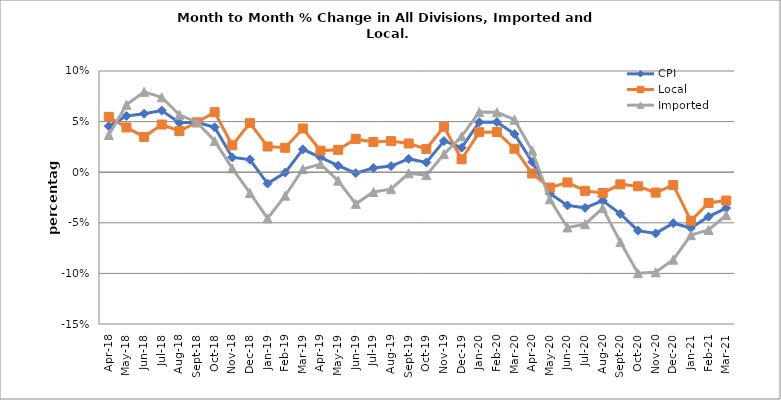
| Category | CPI | Local | Imported |
|---|---|---|---|
| 2018-04-01 | 0.045 | 0.055 | 0.037 |
| 2018-05-01 | 0.056 | 0.044 | 0.067 |
| 2018-06-01 | 0.058 | 0.035 | 0.079 |
| 2018-07-01 | 0.061 | 0.047 | 0.074 |
| 2018-08-01 | 0.049 | 0.041 | 0.057 |
| 2018-09-01 | 0.049 | 0.049 | 0.049 |
| 2018-10-01 | 0.044 | 0.059 | 0.031 |
| 2018-11-01 | 0.015 | 0.027 | 0.004 |
| 2018-12-01 | 0.012 | 0.049 | -0.021 |
| 2019-01-01 | -0.011 | 0.025 | -0.046 |
| 2019-02-01 | 0 | 0.024 | -0.023 |
| 2019-03-01 | 0.023 | 0.043 | 0.003 |
| 2019-04-01 | 0.015 | 0.021 | 0.008 |
| 2019-05-01 | 0.006 | 0.022 | -0.008 |
| 2019-06-01 | -0.001 | 0.033 | -0.031 |
| 2019-07-01 | 0.004 | 0.03 | -0.02 |
| 2019-08-01 | 0.006 | 0.031 | -0.017 |
| 2019-09-01 | 0.013 | 0.028 | -0.001 |
| 2019-10-01 | 0.01 | 0.023 | -0.003 |
| 2019-11-01 | 0.031 | 0.045 | 0.018 |
| 2019-12-01 | 0.024 | 0.013 | 0.035 |
| 2020-01-01 | 0.049 | 0.039 | 0.059 |
| 2020-02-01 | 0.05 | 0.04 | 0.059 |
| 2020-03-01 | 0.038 | 0.023 | 0.052 |
| 2020-04-01 | 0.01 | -0.001 | 0.021 |
| 2020-05-01 | -0.021 | -0.015 | -0.027 |
| 2020-06-01 | -0.033 | -0.01 | -0.055 |
| 2020-07-01 | -0.035 | -0.018 | -0.051 |
| 2020-08-01 | -0.028 | -0.02 | -0.036 |
| 2020-09-01 | -0.041 | -0.012 | -0.069 |
| 2020-10-01 | -0.058 | -0.014 | -0.1 |
| 2020-11-01 | -0.06 | -0.02 | -0.099 |
| 2020-12-01 | -0.05 | -0.013 | -0.086 |
| 2021-01-01 | -0.055 | -0.048 | -0.062 |
| 2021-02-01 | -0.044 | -0.03 | -0.057 |
| 2021-03-01 | -0.035 | -0.028 | -0.043 |